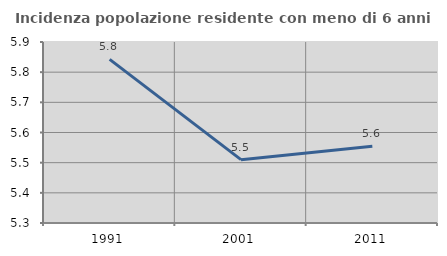
| Category | Incidenza popolazione residente con meno di 6 anni |
|---|---|
| 1991.0 | 5.842 |
| 2001.0 | 5.51 |
| 2011.0 | 5.554 |